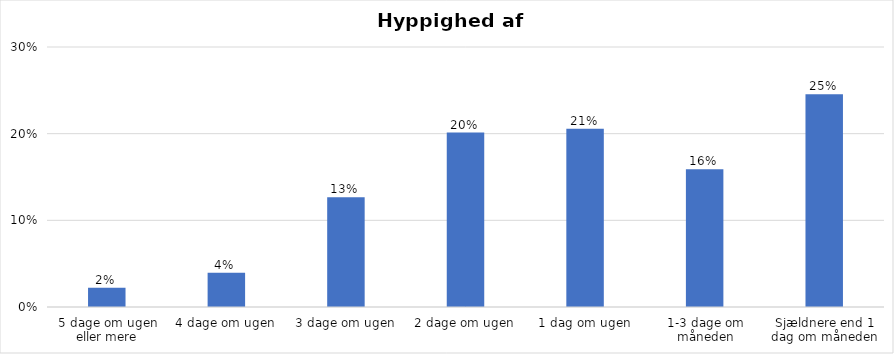
| Category | % |
|---|---|
| 5 dage om ugen eller mere | 0.022 |
| 4 dage om ugen | 0.04 |
| 3 dage om ugen | 0.127 |
| 2 dage om ugen | 0.201 |
| 1 dag om ugen | 0.206 |
| 1-3 dage om måneden | 0.159 |
| Sjældnere end 1 dag om måneden | 0.245 |